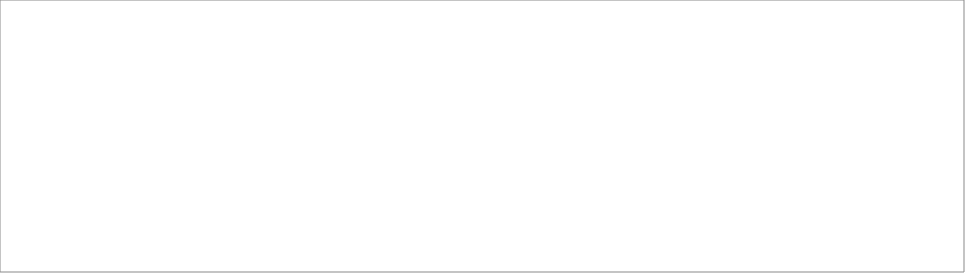
| Category | Total |
|---|---|
| 1 | 9 |
| 2 | 14 |
| 3 | 10 |
| 4 | 12 |
| 5 | 20 |
| 6 | 8 |
| 7 | 2 |
| 8 | 46 |
| 9 | 7 |
| 10 | 6 |
| 11 | 6 |
| 12 | 1 |
| 13 | 4 |
| 14 | 9 |
| 15 | 2 |
| Various | 1 |